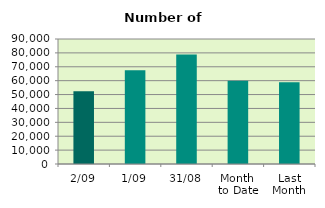
| Category | Series 0 |
|---|---|
| 2/09 | 52464 |
| 1/09 | 67490 |
| 31/08 | 78912 |
| Month 
to Date | 59977 |
| Last
Month | 58874.818 |